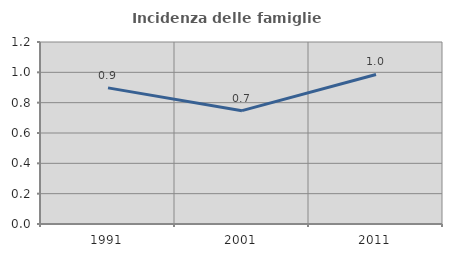
| Category | Incidenza delle famiglie numerose |
|---|---|
| 1991.0 | 0.898 |
| 2001.0 | 0.747 |
| 2011.0 | 0.986 |